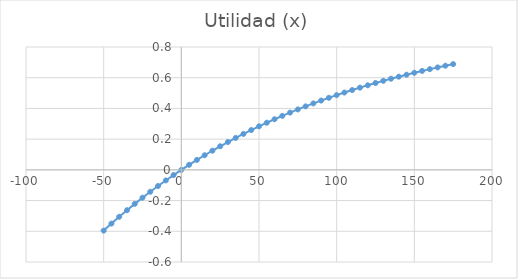
| Category | Series 0 |
|---|---|
| -50.0 | -0.396 |
| -45.0 | -0.35 |
| -40.0 | -0.306 |
| -35.0 | -0.263 |
| -30.0 | -0.221 |
| -25.0 | -0.181 |
| -20.0 | -0.143 |
| -15.0 | -0.105 |
| -10.0 | -0.069 |
| -5.0 | -0.034 |
| 0.0 | 0 |
| 5.0 | 0.033 |
| 10.0 | 0.064 |
| 15.0 | 0.095 |
| 20.0 | 0.125 |
| 25.0 | 0.154 |
| 30.0 | 0.181 |
| 35.0 | 0.208 |
| 40.0 | 0.234 |
| 45.0 | 0.259 |
| 50.0 | 0.283 |
| 55.0 | 0.307 |
| 60.0 | 0.33 |
| 65.0 | 0.352 |
| 70.0 | 0.373 |
| 75.0 | 0.393 |
| 80.0 | 0.413 |
| 85.0 | 0.433 |
| 90.0 | 0.451 |
| 95.0 | 0.469 |
| 100.0 | 0.487 |
| 105.0 | 0.503 |
| 110.0 | 0.52 |
| 115.0 | 0.535 |
| 120.0 | 0.551 |
| 125.0 | 0.565 |
| 130.0 | 0.58 |
| 135.0 | 0.593 |
| 140.0 | 0.607 |
| 145.0 | 0.62 |
| 150.0 | 0.632 |
| 155.0 | 0.644 |
| 160.0 | 0.656 |
| 165.0 | 0.667 |
| 170.0 | 0.678 |
| 175.0 | 0.689 |